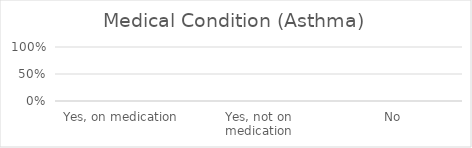
| Category | Asthma |
|---|---|
| Yes, on medication | 0 |
| Yes, not on medication | 0 |
| No | 0 |